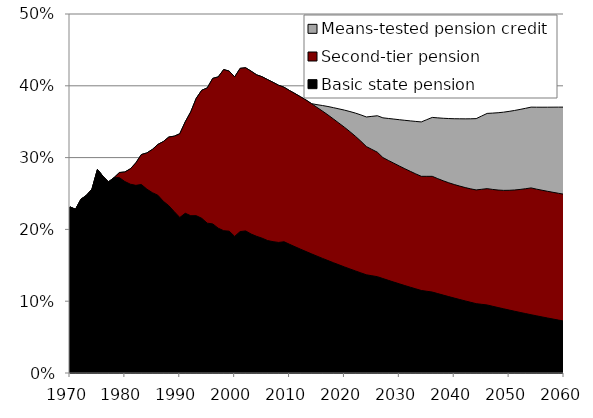
| Category | Means-tested pension credit | Second-tier pension | Basic state pension |
|---|---|---|---|
| 1970.0 | 0.231 | 0.231 | 0.231 |
| 1971.0 | 0.228 | 0.228 | 0.228 |
| 1972.0 | 0.242 | 0.242 | 0.242 |
| 1973.0 | 0.247 | 0.247 | 0.247 |
| 1974.0 | 0.256 | 0.256 | 0.256 |
| 1975.0 | 0.284 | 0.284 | 0.284 |
| 1976.0 | 0.274 | 0.274 | 0.274 |
| 1977.0 | 0.266 | 0.266 | 0.266 |
| 1978.0 | 0.272 | 0.272 | 0.272 |
| 1979.0 | 0.279 | 0.279 | 0.272 |
| 1980.0 | 0.28 | 0.28 | 0.267 |
| 1981.0 | 0.284 | 0.284 | 0.263 |
| 1982.0 | 0.293 | 0.293 | 0.261 |
| 1983.0 | 0.304 | 0.304 | 0.263 |
| 1984.0 | 0.307 | 0.307 | 0.256 |
| 1985.0 | 0.311 | 0.311 | 0.251 |
| 1986.0 | 0.318 | 0.318 | 0.248 |
| 1987.0 | 0.322 | 0.322 | 0.239 |
| 1988.0 | 0.329 | 0.329 | 0.233 |
| 1989.0 | 0.33 | 0.33 | 0.225 |
| 1990.0 | 0.333 | 0.333 | 0.217 |
| 1991.0 | 0.35 | 0.35 | 0.222 |
| 1992.0 | 0.364 | 0.364 | 0.219 |
| 1993.0 | 0.383 | 0.383 | 0.219 |
| 1994.0 | 0.394 | 0.394 | 0.215 |
| 1995.0 | 0.397 | 0.397 | 0.209 |
| 1996.0 | 0.41 | 0.41 | 0.208 |
| 1997.0 | 0.412 | 0.412 | 0.202 |
| 1998.0 | 0.423 | 0.423 | 0.198 |
| 1999.0 | 0.42 | 0.42 | 0.198 |
| 2000.0 | 0.412 | 0.412 | 0.19 |
| 2001.0 | 0.424 | 0.424 | 0.197 |
| 2002.0 | 0.425 | 0.425 | 0.198 |
| 2003.0 | 0.42 | 0.42 | 0.194 |
| 2004.0 | 0.415 | 0.415 | 0.19 |
| 2005.0 | 0.413 | 0.413 | 0.188 |
| 2006.0 | 0.409 | 0.409 | 0.184 |
| 2007.0 | 0.405 | 0.405 | 0.183 |
| 2008.0 | 0.401 | 0.401 | 0.182 |
| 2009.0 | 0.398 | 0.398 | 0.183 |
| 2010.0 | 0.393 | 0.393 | 0.179 |
| 2011.0 | 0.389 | 0.389 | 0.176 |
| 2012.0 | 0.385 | 0.385 | 0.172 |
| 2013.0 | 0.38 | 0.38 | 0.169 |
| 2014.0 | 0.375 | 0.375 | 0.166 |
| 2015.0 | 0.374 | 0.37 | 0.163 |
| 2016.0 | 0.373 | 0.365 | 0.16 |
| 2017.0 | 0.371 | 0.359 | 0.157 |
| 2018.0 | 0.37 | 0.354 | 0.154 |
| 2019.0 | 0.368 | 0.348 | 0.151 |
| 2020.0 | 0.366 | 0.342 | 0.148 |
| 2021.0 | 0.364 | 0.336 | 0.145 |
| 2022.0 | 0.362 | 0.33 | 0.142 |
| 2023.0 | 0.359 | 0.323 | 0.139 |
| 2024.0 | 0.357 | 0.315 | 0.137 |
| 2025.0 | 0.357 | 0.311 | 0.135 |
| 2026.0 | 0.358 | 0.307 | 0.134 |
| 2027.0 | 0.355 | 0.3 | 0.132 |
| 2028.0 | 0.355 | 0.296 | 0.129 |
| 2029.0 | 0.354 | 0.292 | 0.127 |
| 2030.0 | 0.353 | 0.288 | 0.124 |
| 2031.0 | 0.352 | 0.285 | 0.122 |
| 2032.0 | 0.351 | 0.281 | 0.119 |
| 2033.0 | 0.35 | 0.277 | 0.117 |
| 2034.0 | 0.35 | 0.274 | 0.115 |
| 2035.0 | 0.353 | 0.274 | 0.114 |
| 2036.0 | 0.356 | 0.274 | 0.113 |
| 2037.0 | 0.355 | 0.271 | 0.111 |
| 2038.0 | 0.355 | 0.268 | 0.108 |
| 2039.0 | 0.354 | 0.265 | 0.106 |
| 2040.0 | 0.354 | 0.262 | 0.104 |
| 2041.0 | 0.354 | 0.26 | 0.102 |
| 2042.0 | 0.354 | 0.258 | 0.1 |
| 2043.0 | 0.354 | 0.256 | 0.098 |
| 2044.0 | 0.354 | 0.255 | 0.097 |
| 2045.0 | 0.358 | 0.256 | 0.096 |
| 2046.0 | 0.362 | 0.257 | 0.095 |
| 2047.0 | 0.362 | 0.256 | 0.093 |
| 2048.0 | 0.363 | 0.255 | 0.091 |
| 2049.0 | 0.363 | 0.254 | 0.089 |
| 2050.0 | 0.364 | 0.254 | 0.088 |
| 2051.0 | 0.366 | 0.255 | 0.086 |
| 2052.0 | 0.367 | 0.256 | 0.084 |
| 2053.0 | 0.369 | 0.257 | 0.083 |
| 2054.0 | 0.37 | 0.258 | 0.081 |
| 2055.0 | 0.37 | 0.256 | 0.08 |
| 2056.0 | 0.37 | 0.255 | 0.078 |
| 2057.0 | 0.37 | 0.253 | 0.077 |
| 2058.0 | 0.37 | 0.252 | 0.075 |
| 2059.0 | 0.37 | 0.25 | 0.074 |
| 2060.0 | 0.37 | 0.249 | 0.072 |